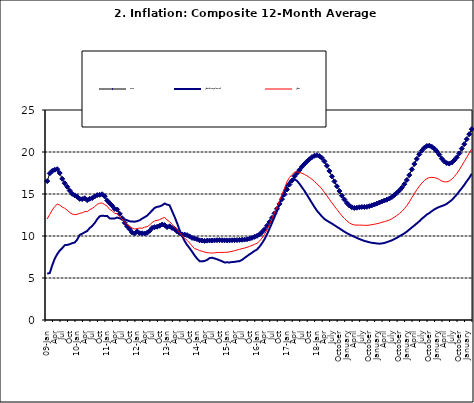
| Category | Food | All Items less Farm Produce | All Items |
|---|---|---|---|
| 09-Jan | 16.536 | 5.519 | 12.032 |
| Feb | 17.454 | 5.591 | 12.567 |
| Mar | 17.742 | 6.51 | 13.101 |
| Apr | 17.89 | 7.302 | 13.51 |
| May | 17.949 | 7.847 | 13.787 |
| June | 17.498 | 8.259 | 13.694 |
| Jul | 16.808 | 8.554 | 13.437 |
| Aug | 16.278 | 8.906 | 13.307 |
| Sep | 15.859 | 8.942 | 13.065 |
| Oct | 15.396 | 9.024 | 12.803 |
| Nov | 15.018 | 9.143 | 12.609 |
| Dec | 14.841 | 9.226 | 12.538 |
| 10-Jan | 14.668 | 9.567 | 12.586 |
| Feb | 14.411 | 10.138 | 12.7 |
| Mar | 14.395 | 10.269 | 12.757 |
| Apr | 14.489 | 10.444 | 12.915 |
| May | 14.266 | 10.597 | 12.893 |
| Jun | 14.424 | 10.948 | 13.132 |
| Jul | 14.514 | 11.193 | 13.284 |
| Aug | 14.706 | 11.549 | 13.5 |
| Sep | 14.872 | 11.997 | 13.764 |
| Oct | 14.906 | 12.345 | 13.908 |
| Nov | 14.967 | 12.423 | 13.928 |
| Dec | 14.723 | 12.383 | 13.74 |
| 11-Jan | 14.233 | 12.385 | 13.542 |
| Feb | 13.903 | 12.099 | 13.161 |
| Mar | 13.606 | 12.077 | 13.001 |
| Apr | 13.227 | 12.088 | 12.694 |
| May | 13.152 | 12.198 | 12.648 |
| Jun | 12.654 | 12.1 | 12.321 |
| Jul | 12.118 | 12.109 | 12.009 |
| Aug | 11.575 | 11.98 | 11.635 |
| Sep | 11.155 | 11.877 | 11.363 |
| Oct | 10.797 | 11.746 | 11.13 |
| Nov | 10.422 | 11.721 | 10.952 |
| Dec | 10.298 | 11.706 | 10.826 |
| 12-Jan | 10.538 | 11.765 | 10.886 |
| 12-Feb | 10.336 | 11.872 | 10.955 |
| 12-Mar | 10.325 | 12.075 | 10.914 |
| Apr | 10.304 | 12.242 | 11.054 |
| May | 10.387 | 12.419 | 11.096 |
| Jun | 10.617 | 12.732 | 11.32 |
| Jul | 10.963 | 13.032 | 11.599 |
| Aug | 11.056 | 13.349 | 11.791 |
| Sep | 11.104 | 13.467 | 11.859 |
| Oct | 11.216 | 13.525 | 11.948 |
| Nov | 11.372 | 13.649 | 12.091 |
| Dec | 11.296 | 13.873 | 12.224 |
| 13-Jan | 11.055 | 13.737 | 11.908 |
| Feb | 11.153 | 13.657 | 11.703 |
| Mar | 10.951 | 12.963 | 11.394 |
| Apr | 10.844 | 12.281 | 11.072 |
| May | 10.548 | 11.531 | 10.761 |
| Jun | 10.352 | 10.704 | 10.383 |
| Jul | 10.186 | 10.005 | 10.047 |
| Aug | 10.168 | 9.4 | 9.761 |
| Sep | 10.105 | 8.939 | 9.486 |
| Oct | 9.955 | 8.553 | 9.167 |
| Nov | 9.774 | 8.136 | 8.815 |
| Dec | 9.695 | 7.691 | 8.496 |
| 14-Jan | 9.626 | 7.317 | 8.408 |
| Feb | 9.484 | 7.005 | 8.257 |
| Mar | 9.464 | 6.976 | 8.19 |
| Apr | 9.416 | 7.03 | 8.092 |
| May | 9.448 | 7.151 | 8.012 |
| Jun | 9.464 | 7.369 | 7.998 |
| Jul | 9.459 | 7.411 | 7.968 |
| Aug | 9.481 | 7.325 | 7.996 |
| Sep | 9.501 | 7.228 | 8.027 |
| Oct | 9.508 | 7.116 | 8.047 |
| Nov | 9.492 | 6.991 | 8.046 |
| Dec | 9.481 | 6.854 | 8.047 |
| 15-Jan | 9.475 | 6.865 | 8.063 |
| Feb | 9.486 | 6.852 | 8.117 |
| Mar | 9.495 | 6.905 | 8.176 |
| Apr | 9.501 | 6.922 | 8.243 |
| May | 9.51 | 6.975 | 8.331 |
| Jun | 9.535 | 7.006 | 8.417 |
| Jul | 9.552 | 7.154 | 8.497 |
| Aug | 9.571 | 7.384 | 8.566 |
| Sep | 9.614 | 7.605 | 8.658 |
| Oct | 9.68 | 7.812 | 8.76 |
| Nov | 9.778 | 8.016 | 8.879 |
| Dec | 9.898 | 8.222 | 9.009 |
| 16-Jan | 10.017 | 8.391 | 9.13 |
| Feb | 10.184 | 8.732 | 9.386 |
| Mar | 10.471 | 9.132 | 9.751 |
| Apr | 10.786 | 9.614 | 10.182 |
| May | 11.221 | 10.196 | 10.746 |
| Jun | 11.672 | 10.864 | 11.372 |
| Jul | 12.162 | 11.553 | 12.045 |
| Aug | 12.696 | 12.247 | 12.744 |
| Sep | 13.238 | 12.98 | 13.454 |
| Oct | 13.817 | 13.757 | 14.206 |
| Nov | 14.386 | 14.542 | 14.958 |
| Dec | 14.946 | 15.307 | 15.697 |
| 17-Jan | 15.536 | 16.042 | 16.441 |
| Feb | 16.127 | 16.436 | 16.958 |
| Mar | 16.598 | 16.682 | 17.315 |
| Apr | 17.106 | 16.772 | 17.591 |
| May | 17.477 | 16.567 | 17.628 |
| Jun | 17.868 | 16.219 | 17.578 |
| Jul | 18.247 | 15.798 | 17.475 |
| Aug | 18.569 | 15.372 | 17.331 |
| Sep | 18.876 | 14.903 | 17.17 |
| Oct | 19.14 | 14.415 | 16.968 |
| Nov | 19.392 | 13.93 | 16.76 |
| Dec | 19.546 | 13.458 | 16.502 |
| 18-Jan | 19.621 | 13.01 | 16.215 |
| Feb | 19.521 | 12.668 | 15.93 |
| Mar | 19.294 | 12.33 | 15.599 |
| Apr | 18.886 | 12.021 | 15.196 |
| May | 18.359 | 11.828 | 14.793 |
| June | 17.745 | 11.651 | 14.371 |
| July | 17.102 | 11.478 | 13.95 |
| August | 16.501 | 11.285 | 13.546 |
| September | 15.923 | 11.092 | 13.157 |
| October | 15.355 | 10.903 | 12.777 |
| November | 14.802 | 10.703 | 12.406 |
| December | 14.348 | 10.514 | 12.095 |
| January | 13.934 | 10.339 | 11.801 |
| February | 13.62 | 10.185 | 11.564 |
| March | 13.42 | 10.044 | 11.401 |
| April | 13.339 | 9.909 | 11.314 |
| May | 13.371 | 9.77 | 11.299 |
| June | 13.418 | 9.64 | 11.297 |
| July | 13.46 | 9.524 | 11.291 |
| August | 13.458 | 9.411 | 11.271 |
| September | 13.474 | 9.337 | 11.268 |
| October | 13.544 | 9.253 | 11.298 |
| November | 13.646 | 9.189 | 11.348 |
| December | 13.743 | 9.155 | 11.396 |
| January | 13.859 | 9.112 | 11.462 |
| February | 13.98 | 9.086 | 11.539 |
| March | 14.109 | 9.112 | 11.624 |
| April | 14.221 | 9.174 | 11.706 |
| May | 14.325 | 9.267 | 11.791 |
| June | 14.46 | 9.375 | 11.904 |
| July | 14.634 | 9.484 | 12.049 |
| August | 14.869 | 9.638 | 12.233 |
| September | 15.135 | 9.775 | 12.44 |
| October | 15.416 | 9.965 | 12.664 |
| November | 15.746 | 10.136 | 12.923 |
| December | 16.169 | 10.308 | 13.246 |
| January | 16.662 | 10.519 | 13.616 |
| February | 17.251 | 10.767 | 14.053 |
| March | 17.929 | 11.015 | 14.554 |
| April | 18.576 | 11.247 | 15.039 |
| May | 19.176 | 11.502 | 15.499 |
| June | 19.721 | 11.75 | 15.927 |
| July | 20.165 | 12.052 | 16.298 |
| August | 20.499 | 12.291 | 16.601 |
| September | 20.711 | 12.553 | 16.83 |
| October | 20.753 | 12.725 | 16.958 |
| November | 20.619 | 12.956 | 16.979 |
| December | 20.403 | 13.161 | 16.953 |
| January | 20.089 | 13.326 | 16.869 |
| February | 19.687 | 13.461 | 16.728 |
| March | 19.214 | 13.562 | 16.544 |
| April | 18.876 | 13.681 | 16.449 |
| May | 18.679 | 13.83 | 16.449 |
| June | 18.619 | 14.057 | 16.542 |
| July | 18.745 | 14.278 | 16.755 |
| August | 19.021 | 14.603 | 17.07 |
| September | 19.365 | 14.934 | 17.432 |
| October | 19.829 | 15.315 | 17.865 |
| November | 20.407 | 15.687 | 18.372 |
| December | 20.937 | 16.075 | 18.847 |
| January | 21.53 | 16.519 | 19.362 |
| February | 22.124 | 16.92 | 19.873 |
| March | 22.715 | 17.413 | 20.375 |